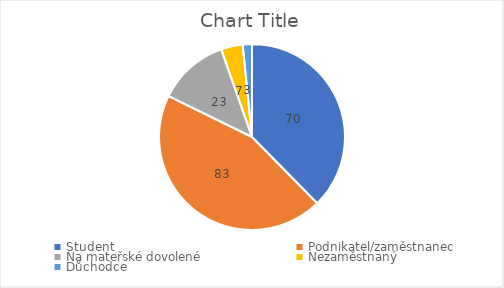
| Category | Series 0 |
|---|---|
| Student | 70 |
| Podnikatel/zaměstnanec | 83 |
| Na mateřské dovolené | 23 |
| Nezaměstnaný | 7 |
| Důchodce | 3 |